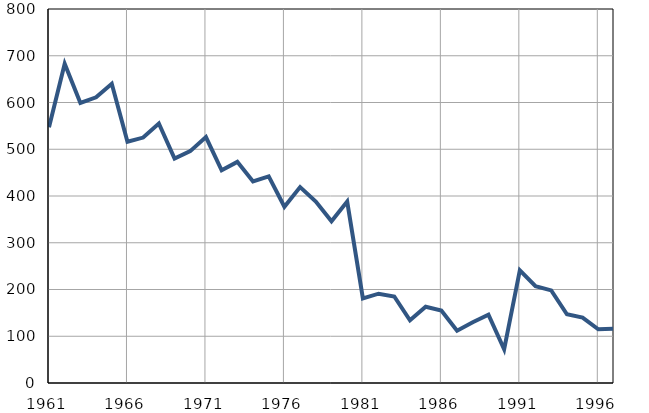
| Category | Умрла 
одојчад |
|---|---|
| 1961.0 | 547 |
| 1962.0 | 683 |
| 1963.0 | 599 |
| 1964.0 | 611 |
| 1965.0 | 640 |
| 1966.0 | 516 |
| 1967.0 | 525 |
| 1968.0 | 555 |
| 1969.0 | 480 |
| 1970.0 | 496 |
| 1971.0 | 526 |
| 1972.0 | 455 |
| 1973.0 | 473 |
| 1974.0 | 431 |
| 1975.0 | 442 |
| 1976.0 | 377 |
| 1977.0 | 419 |
| 1978.0 | 388 |
| 1979.0 | 346 |
| 1980.0 | 388 |
| 1981.0 | 181 |
| 1982.0 | 191 |
| 1983.0 | 185 |
| 1984.0 | 134 |
| 1985.0 | 163 |
| 1986.0 | 155 |
| 1987.0 | 112 |
| 1988.0 | 130 |
| 1989.0 | 146 |
| 1990.0 | 72 |
| 1991.0 | 241 |
| 1992.0 | 207 |
| 1993.0 | 198 |
| 1994.0 | 147 |
| 1995.0 | 140 |
| 1996.0 | 115 |
| 1997.0 | 116 |